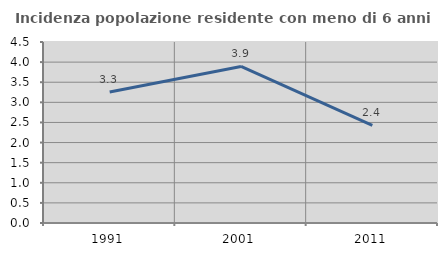
| Category | Incidenza popolazione residente con meno di 6 anni |
|---|---|
| 1991.0 | 3.257 |
| 2001.0 | 3.892 |
| 2011.0 | 2.424 |